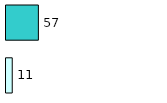
| Category | Series 0 | Series 1 |
|---|---|---|
| 0 | 11 | 57 |